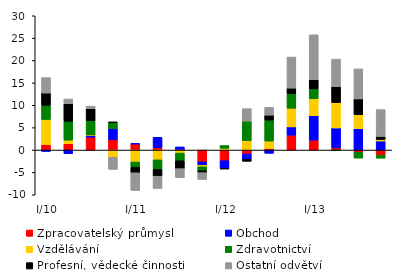
| Category | Zpracovatelský průmysl | Obchod | Vzdělávání | Zdravotnictví | Profesní, vědecké činnosti | Ostatní odvětví |
|---|---|---|---|---|---|---|
|  I/10 | 1.213 | -0.32 | 5.601 | 3.186 | 2.734 | 3.449 |
|  II | 1.415 | -0.817 | 0.799 | 4.217 | 3.92 | 1.037 |
|  III | 2.875 | 0.413 | 0.094 | 3.19 | 2.673 | 0.562 |
|  IV | 2.291 | 2.511 | -1.616 | 1.377 | 0.042 | -2.7 |
|  I/11 | 1.399 | 0.005 | -2.671 | -1.157 | -1.257 | -3.962 |
|  II | 0.554 | 2.292 | -2.195 | -2.149 | -1.505 | -2.719 |
|  III | 0 | 0.7 | -0.684 | -1.712 | -1.767 | -2.028 |
|  IV | -2.64 | -0.772 | -0.325 | -0.877 | -0.439 | -1.521 |
|  I/12 | -2.385 | -1.72 | 0.408 | 0.6 | -0.18 | -0.136 |
|  II | -0.865 | -1.22 | 2.082 | 4.376 | -0.422 | 2.788 |
|  III | 0.323 | -0.734 | 1.679 | 4.68 | 1.113 | 1.748 |
|  IV | 3.322 | 1.847 | 4.174 | 3.251 | 1.244 | 6.95 |
|  I/13 | 2.206 | 5.464 | 3.804 | 2.188 | 2.091 | 10 |
|  II | 0.494 | 4.434 | 5.657 | -0.101 | 3.551 | 6.166 |
|  III | -0.504 | 4.766 | 3.149 | -1.293 | 3.513 | 6.706 |
|  IV | -1.13 | 2.021 | 0.331 | -0.692 | 0.678 | 6.003 |